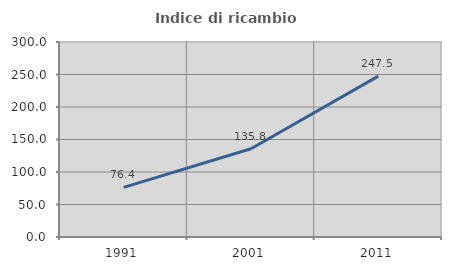
| Category | Indice di ricambio occupazionale  |
|---|---|
| 1991.0 | 76.433 |
| 2001.0 | 135.802 |
| 2011.0 | 247.541 |